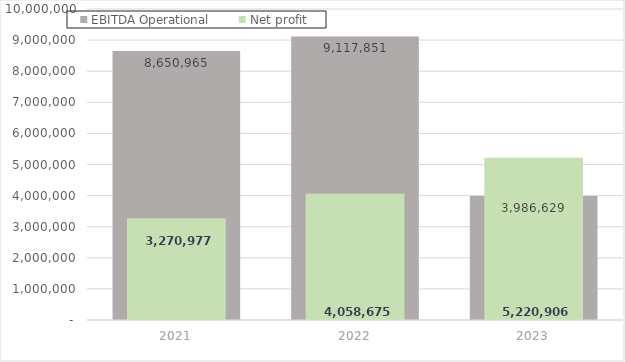
| Category | EBITDA Operational |
|---|---|
| 2021.0 | 8650965 |
| 2022.0 | 9117851 |
| 2023.0 | 3986629.48 |